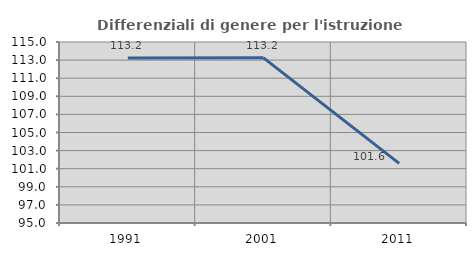
| Category | Differenziali di genere per l'istruzione superiore |
|---|---|
| 1991.0 | 113.231 |
| 2001.0 | 113.247 |
| 2011.0 | 101.589 |